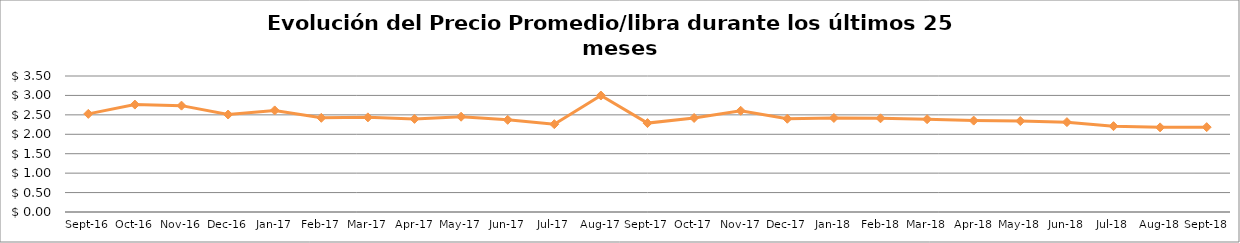
| Category | Series 0 |
|---|---|
| 2016-09-01 | 2.525 |
| 2016-10-01 | 2.764 |
| 2016-11-01 | 2.737 |
| 2016-12-01 | 2.508 |
| 2017-01-01 | 2.615 |
| 2017-02-01 | 2.424 |
| 2017-03-01 | 2.436 |
| 2017-04-01 | 2.396 |
| 2017-05-01 | 2.452 |
| 2017-06-01 | 2.372 |
| 2017-07-01 | 2.26 |
| 2017-08-01 | 2.997 |
| 2017-09-01 | 2.288 |
| 2017-10-01 | 2.421 |
| 2017-11-01 | 2.605 |
| 2017-12-01 | 2.4 |
| 2018-01-01 | 2.42 |
| 2018-02-01 | 2.412 |
| 2018-03-01 | 2.388 |
| 2018-04-01 | 2.352 |
| 2018-05-01 | 2.341 |
| 2018-06-01 | 2.312 |
| 2018-07-01 | 2.209 |
| 2018-08-01 | 2.178 |
| 2018-09-01 | 2.184 |